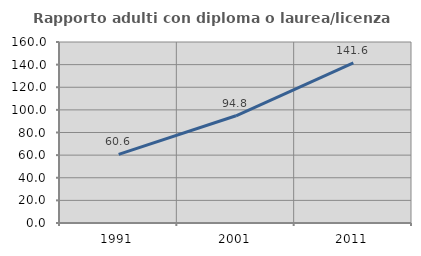
| Category | Rapporto adulti con diploma o laurea/licenza media  |
|---|---|
| 1991.0 | 60.61 |
| 2001.0 | 94.774 |
| 2011.0 | 141.571 |